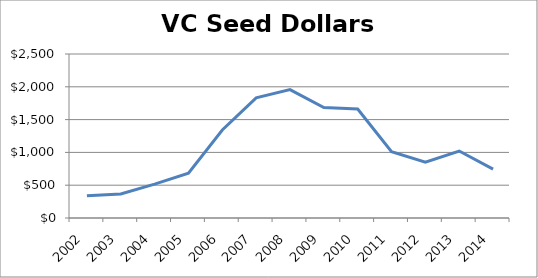
| Category | Seed Dollars |
|---|---|
| 2002.0 | 340 |
| 2003.0 | 365 |
| 2004.0 | 517 |
| 2005.0 | 684 |
| 2006.0 | 1342 |
| 2007.0 | 1832 |
| 2008.0 | 1957 |
| 2009.0 | 1684 |
| 2010.0 | 1661 |
| 2011.0 | 1011 |
| 2012.0 | 851 |
| 2013.0 | 1021 |
| 2014.0 | 744 |